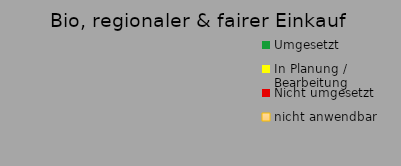
| Category | Series 0 |
|---|---|
| Umgesetzt | 0 |
| In Planung / Bearbeitung | 0 |
| Nicht umgesetzt | 0 |
| nicht anwendbar | 0 |